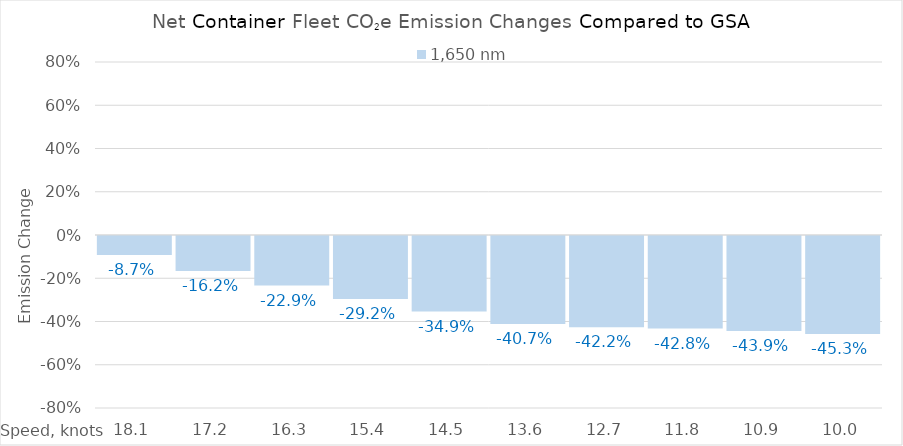
| Category | 1,650 |
|---|---|
| 18.1 | -0.087 |
| 17.200000000000003 | -0.162 |
| 16.300000000000004 | -0.229 |
| 15.400000000000004 | -0.292 |
| 14.500000000000004 | -0.349 |
| 13.600000000000003 | -0.407 |
| 12.700000000000003 | -0.422 |
| 11.800000000000002 | -0.428 |
| 10.900000000000002 | -0.439 |
| 10.000000000000002 | -0.453 |